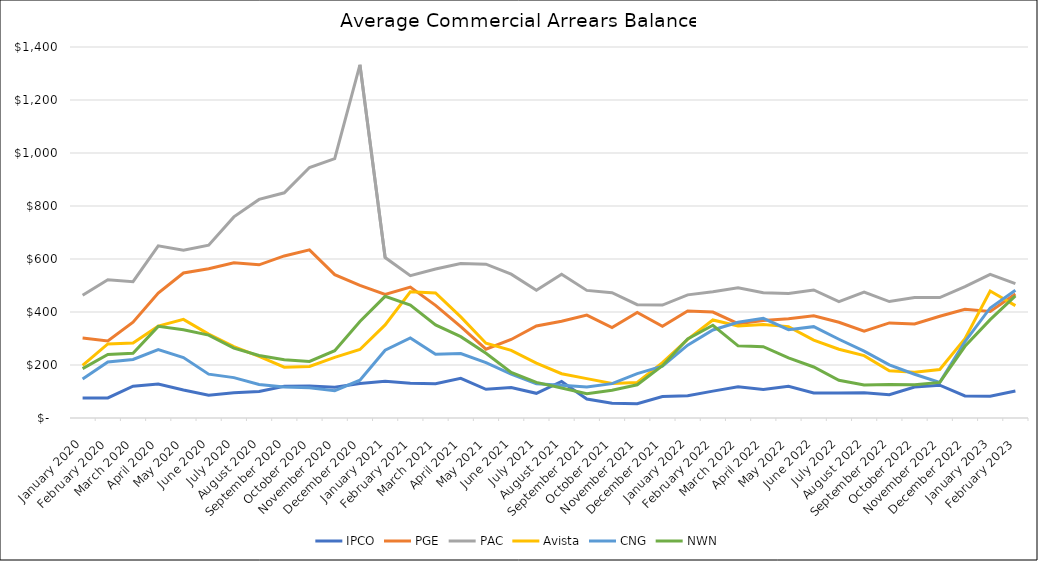
| Category | IPCO | PGE | PAC | Avista | CNG | NWN |
|---|---|---|---|---|---|---|
| 2020-01-01 | 75.734 | 301.523 | 463.4 | 198.647 | 147.062 | 186.205 |
| 2020-02-01 | 75.652 | 290.815 | 521.692 | 279.469 | 211.53 | 239.864 |
| 2020-03-01 | 120.082 | 361.755 | 514.52 | 283.005 | 220.739 | 244.525 |
| 2020-04-01 | 128.188 | 471.414 | 649.469 | 346.565 | 258.066 | 345.725 |
| 2020-05-01 | 105.552 | 547.271 | 633.316 | 372.103 | 227.862 | 333.133 |
| 2020-06-01 | 86.153 | 563.55 | 652.096 | 316.636 | 165.513 | 312.707 |
| 2020-07-01 | 95.089 | 585.436 | 758.921 | 269.139 | 152.451 | 263.453 |
| 2020-08-01 | 100.259 | 578.058 | 824.905 | 232.937 | 126.639 | 236.168 |
| 2020-09-01 | 119.832 | 611.625 | 849.783 | 191.904 | 117.208 | 219.891 |
| 2020-10-01 | 120.996 | 634.676 | 945.284 | 194.438 | 113.696 | 213.406 |
| 2020-11-01 | 116.157 | 541.042 | 978.839 | 229.033 | 103.184 | 254.171 |
| 2020-12-01 | 129.989 | 500.392 | 1332.879 | 258.465 | 142.558 | 364.526 |
| 2021-01-01 | 138.495 | 466.112 | 605.5 | 351.272 | 255.856 | 459.14 |
| 2021-02-01 | 130.838 | 494.137 | 537.3 | 476.067 | 302.377 | 426.409 |
| 2021-03-01 | 129.289 | 424.93 | 562.082 | 471.582 | 240.848 | 351.489 |
| 2021-04-01 | 149.413 | 344.559 | 582.85 | 381.688 | 243.268 | 306.847 |
| 2021-05-01 | 108.12 | 259.637 | 580.498 | 282.02 | 208.967 | 244.285 |
| 2021-06-01 | 114.65 | 296.355 | 542.696 | 255.209 | 166.058 | 171.832 |
| 2021-07-01 | 93.202 | 347.165 | 481.836 | 207.01 | 129.124 | 134.532 |
| 2021-08-01 | 137.886 | 365.32 | 542.696 | 167.095 | 123.628 | 113.113 |
| 2021-09-01 | 71.83 | 388.299 | 481.495 | 148.68 | 117.366 | 91.999 |
| 2021-10-01 | 55.859 | 341.431 | 472.7 | 130.067 | 129.633 | 104.78 |
| 2021-11-01 | 53.754 | 398.123 | 427.654 | 133.994 | 167.572 | 125.368 |
| 2021-12-01 | 80.943 | 346.415 | 426.021 | 208.762 | 195.387 | 197.432 |
| 2022-01-01 | 84.292 | 403.488 | 464.75 | 297.007 | 275.043 | 298.679 |
| 2022-02-01 | 101.459 | 399.605 | 476.46 | 369.864 | 332.228 | 349.841 |
| 2022-03-01 | 117.45 | 355.854 | 490.99 | 346.888 | 361.401 | 272.175 |
| 2022-04-01 | 107.357 | 367.671 | 472.32 | 352.734 | 376.135 | 268.911 |
| 2022-05-01 | 120.015 | 374.366 | 470.284 | 344.829 | 333.36 | 226.567 |
| 2022-06-01 | 94.604 | 385.481 | 483.015 | 294.129 | 344.764 | 192.45 |
| 2022-07-01 | 94.794 | 361.108 | 439.424 | 259.643 | 297.24 | 142.516 |
| 2022-08-01 | 95.72 | 327.412 | 474.725 | 235.337 | 252.175 | 124.57 |
| 2022-09-01 | 87.777 | 358.75 | 439.424 | 178.615 | 200.341 | 126.139 |
| 2022-10-01 | 116.67 | 354.94 | 454.33 | 172.807 | 165.139 | 125.477 |
| 2022-11-01 | 123.743 | 383.76 | 454.52 | 183.138 | 134.374 | 134.183 |
| 2022-12-01 | 83.42 | 410.372 | 496.017 | 299.559 | 287.983 | 270.605 |
| 2023-01-01 | 82.343 | 402.226 | 542.281 | 479.405 | 415.198 | 371.332 |
| 2023-02-01 | 102.02 | 468.116 | 507.275 | 424.071 | 482.442 | 460.843 |